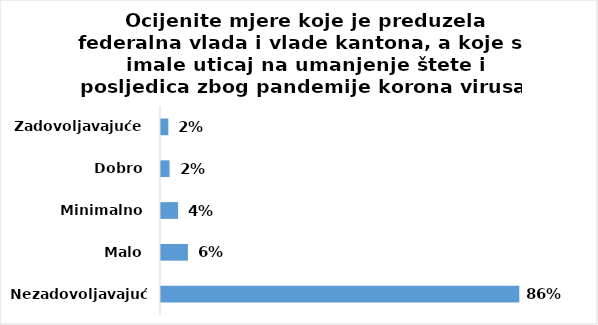
| Category | Series 0 |
|---|---|
| Nezadovoljavajuće | 293 |
| Malo | 22 |
| Minimalno | 14 |
| Dobro | 7 |
| Zadovoljavajuće | 6 |